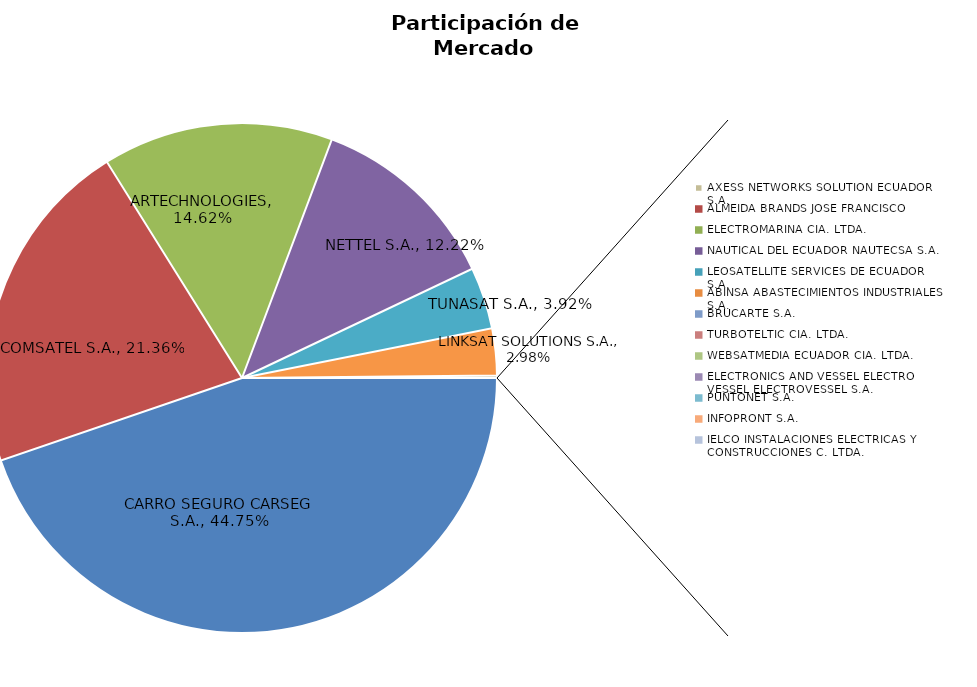
| Category | Series 0 |
|---|---|
| CARRO SEGURO CARSEG S.A. | 0.448 |
| COMSATEL S.A. | 0.214 |
| ARTECHNOLOGIES | 0.146 |
| NETTEL S.A. | 0.122 |
| TUNASAT S.A. | 0.039 |
| LINKSAT SOLUTIONS S.A. | 0.03 |
| AXESS NETWORKS SOLUTION ECUADOR S.A. | 0.002 |
| ALMEIDA BRANDS JOSE FRANCISCO | 0 |
| ELECTROMARINA CIA. LTDA. | 0 |
| NAUTICAL DEL ECUADOR NAUTECSA S.A. | 0 |
| LEOSATELLITE SERVICES DE ECUADOR S.A. | 0 |
| ABINSA ABASTECIMIENTOS INDUSTRIALES S.A. | 0 |
| BRUCARTE S.A. | 0 |
| TURBOTELTIC CIA. LTDA. | 0 |
| WEBSATMEDIA ECUADOR CIA. LTDA. | 0 |
| ELECTRONICS AND VESSEL ELECTRO VESSEL ELECTROVESSEL S.A. | 0 |
| PUNTONET S.A. | 0 |
| INFOPRONT S.A. | 0 |
| IELCO INSTALACIONES ELECTRICAS Y CONSTRUCCIONES C. LTDA. | 0 |